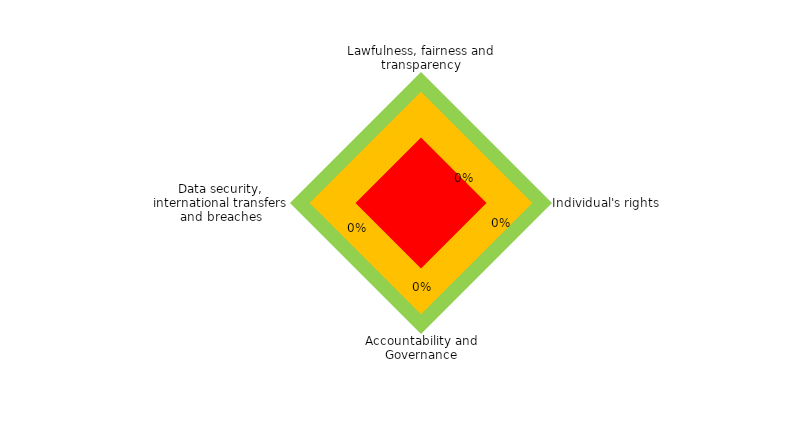
| Category | Compliant | Minor Work | Major Work |
|---|---|---|---|
| Lawfulness, fairness and transparency | 1 | 0.85 | 0.5 |
| Individual's rights | 1 | 0.85 | 0.5 |
| Accountability and Governance | 1 | 0.85 | 0.5 |
| Data security, international transfers and breaches | 1 | 0.85 | 0.5 |